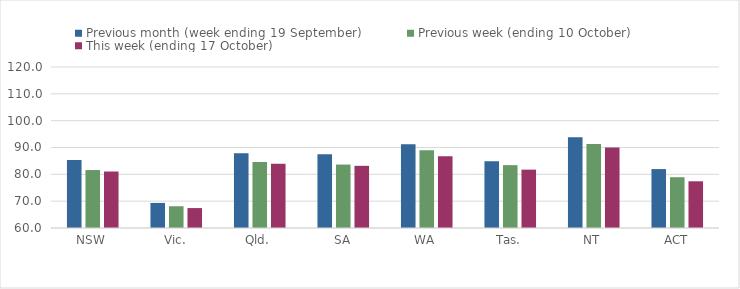
| Category | Previous month (week ending 19 September) | Previous week (ending 10 October) | This week (ending 17 October) |
|---|---|---|---|
| NSW | 85.36 | 81.6 | 81.05 |
| Vic. | 69.34 | 68.11 | 67.43 |
| Qld. | 87.85 | 84.59 | 83.91 |
| SA | 87.5 | 83.64 | 83.17 |
| WA | 91.21 | 88.93 | 86.74 |
| Tas. | 84.92 | 83.42 | 81.75 |
| NT | 93.84 | 91.34 | 90.02 |
| ACT | 81.96 | 78.92 | 77.41 |